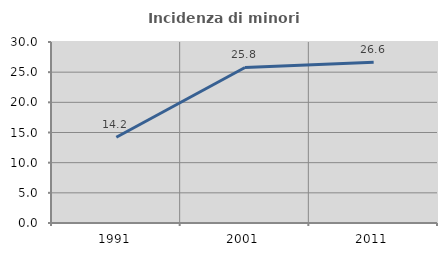
| Category | Incidenza di minori stranieri |
|---|---|
| 1991.0 | 14.208 |
| 2001.0 | 25.781 |
| 2011.0 | 26.63 |